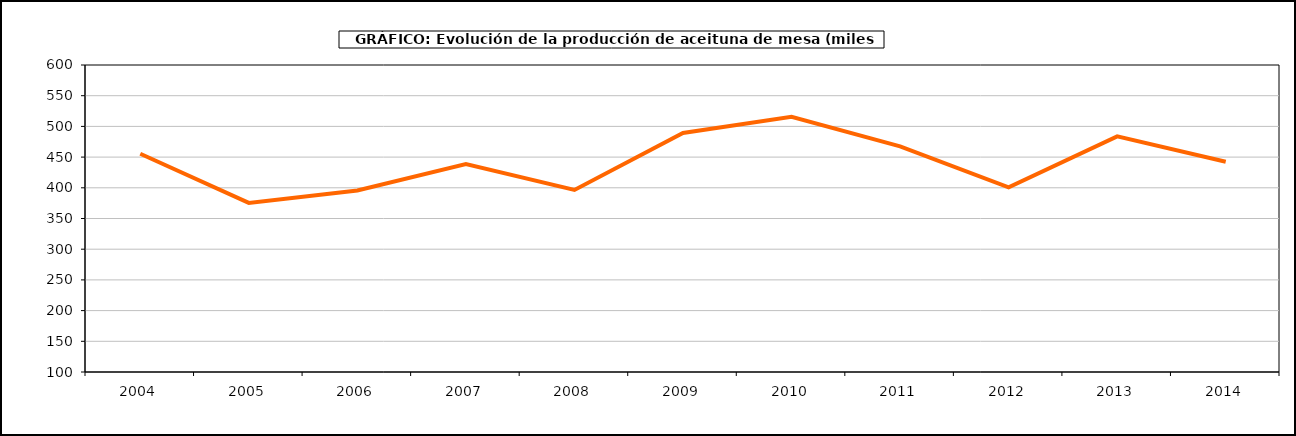
| Category | producción |
|---|---|
| 2004.0 | 455.392 |
| 2005.0 | 375.419 |
| 2006.0 | 395.676 |
| 2007.0 | 438.572 |
| 2008.0 | 396.432 |
| 2009.0 | 489.368 |
| 2010.0 | 515.591 |
| 2011.0 | 467.363 |
| 2012.0 | 400.651 |
| 2013.0 | 483.713 |
| 2014.0 | 442.478 |